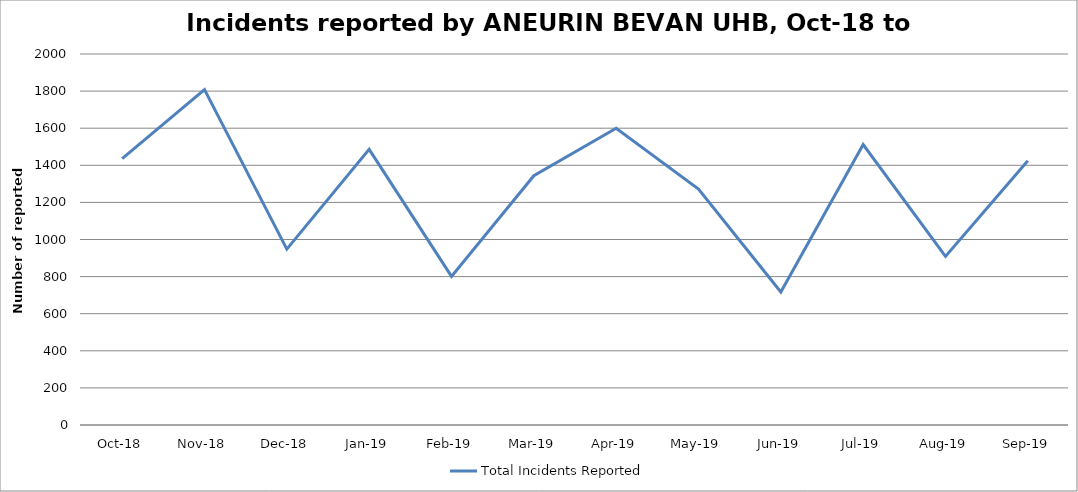
| Category | Total Incidents Reported |
|---|---|
| Oct-18 | 1436 |
| Nov-18 | 1808 |
| Dec-18 | 948 |
| Jan-19 | 1486 |
| Feb-19 | 801 |
| Mar-19 | 1344 |
| Apr-19 | 1600 |
| May-19 | 1272 |
| Jun-19 | 717 |
| Jul-19 | 1512 |
| Aug-19 | 909 |
| Sep-19 | 1425 |